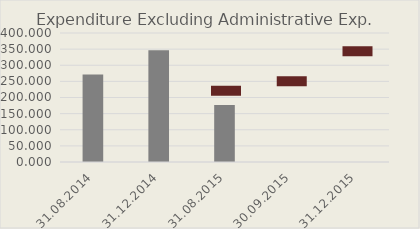
| Category | Expenditure Excluding Administrative Exp. |
|---|---|
| 31.08.2014 | 271.056 |
| 31.12.2014 | 346.73 |
| 31.08.2015 | 177.085 |
| 30.09.2015 | 0 |
| 31.12.2015 | 0 |